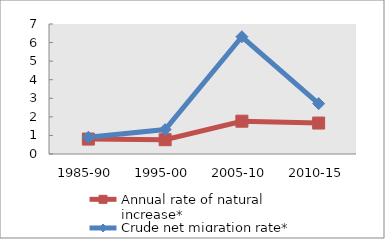
| Category | Annual rate of natural increase* | Crude net migration rate* |
|---|---|---|
| 1985-90 | 0.804 | 0.902 |
| 1995-00 | 0.769 | 1.315 |
| 2005-10 | 1.766 | 6.313 |
| 2010-15 | 1.666 | 2.712 |